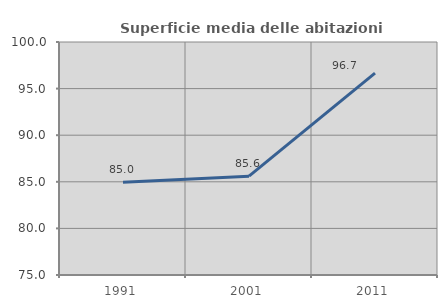
| Category | Superficie media delle abitazioni occupate |
|---|---|
| 1991.0 | 84.958 |
| 2001.0 | 85.605 |
| 2011.0 | 96.652 |